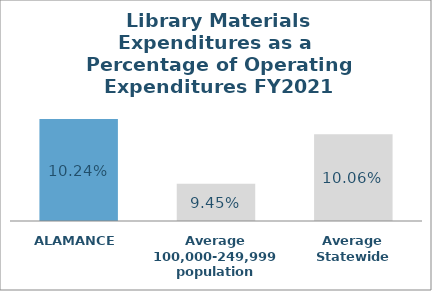
| Category | Series 0 |
|---|---|
| ALAMANCE | 0.102 |
| Average 100,000-249,999 population | 0.095 |
| Average Statewide | 0.101 |